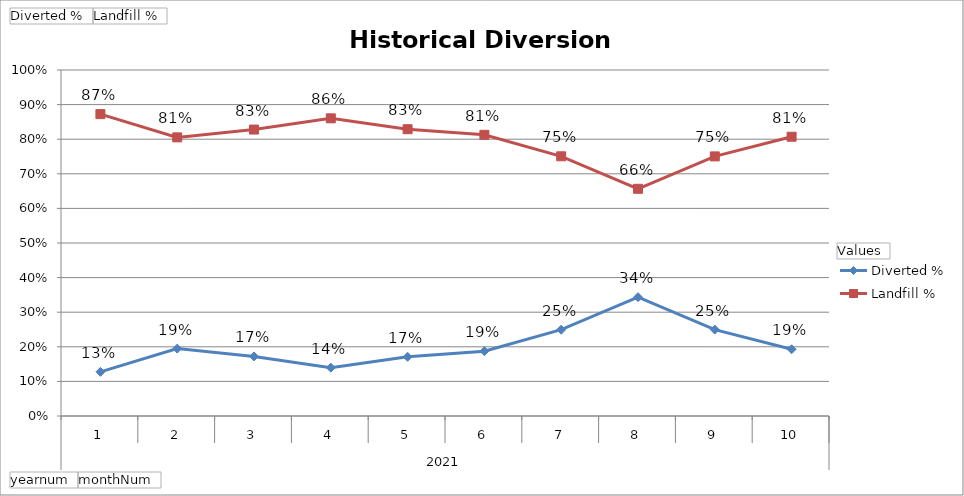
| Category | Diverted % | Landfill % |
|---|---|---|
| 0 | 0.128 | 0.872 |
| 1 | 0.195 | 0.805 |
| 2 | 0.172 | 0.828 |
| 3 | 0.14 | 0.86 |
| 4 | 0.171 | 0.829 |
| 5 | 0.187 | 0.813 |
| 6 | 0.249 | 0.751 |
| 7 | 0.343 | 0.657 |
| 8 | 0.25 | 0.75 |
| 9 | 0.193 | 0.807 |